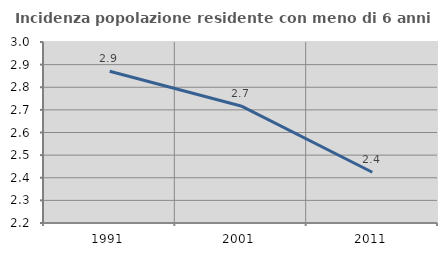
| Category | Incidenza popolazione residente con meno di 6 anni |
|---|---|
| 1991.0 | 2.871 |
| 2001.0 | 2.717 |
| 2011.0 | 2.424 |